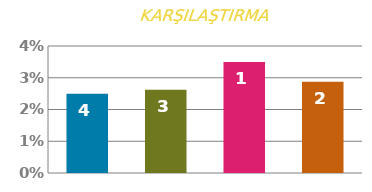
| Category | ÜCRET |
|---|---|
| 0 | 0.025 |
| 1 | 0.026 |
| 2 | 0.035 |
| 3 | 0.029 |